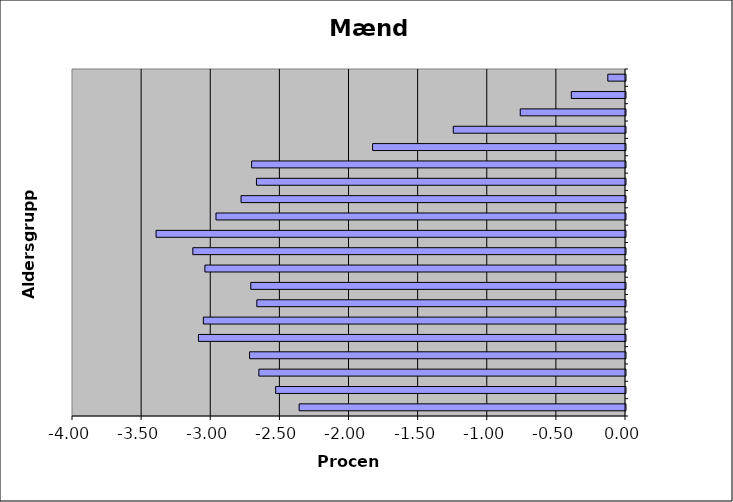
| Category | Mænd |
|---|---|
|  | -2.36 |
|  | -2.531 |
|  | -2.652 |
|  | -2.719 |
|  | -3.089 |
|  | -3.053 |
|  | -2.667 |
|  | -2.71 |
|  | -3.042 |
|  | -3.13 |
|  | -3.395 |
|  | -2.962 |
|  | -2.781 |
|  | -2.669 |
|  | -2.704 |
|  | -1.829 |
|  | -1.246 |
|  | -0.761 |
|  | -0.392 |
|  | -0.128 |